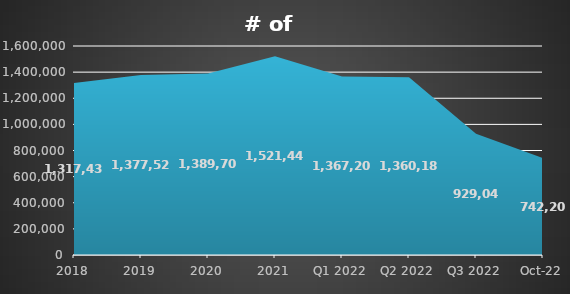
| Category | # of producers* |
|---|---|
| 2018 | 1317435 |
| 2019 | 1377528 |
| 2020 | 1389702 |
| 2021 | 1521444 |
| Q1 2022 | 1367207 |
| Q2 2022 | 1360180 |
| Q3 2022 | 929045 |
| Oct-22 | 742209 |